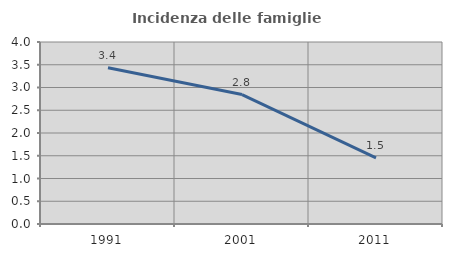
| Category | Incidenza delle famiglie numerose |
|---|---|
| 1991.0 | 3.435 |
| 2001.0 | 2.846 |
| 2011.0 | 1.455 |